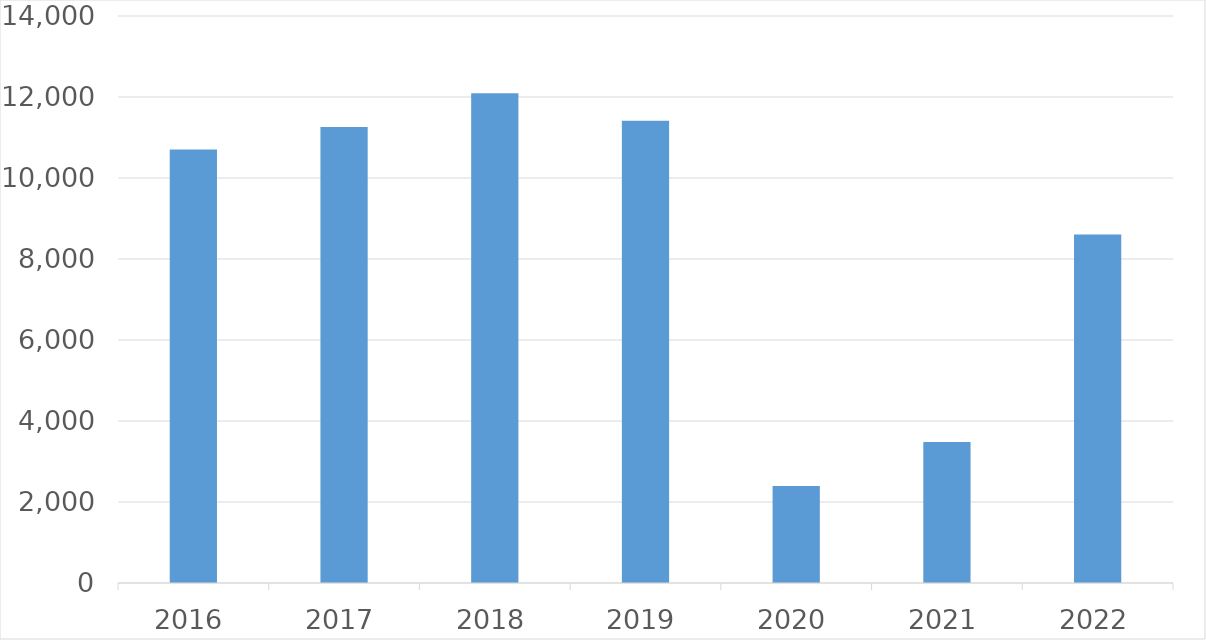
| Category | Series 0 |
|---|---|
| 2016 | 10705 |
| 2017 | 11262 |
| 2018 | 12093 |
| 2019 | 11414 |
| 2020 | 2398 |
| 2021 | 3483 |
| 2022 | 8605 |